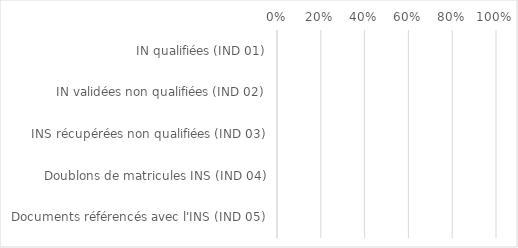
| Category | Series 0 |
|---|---|
| IN qualifiées (IND 01) | 0 |
| IN validées non qualifiées (IND 02) | 0 |
| INS récupérées non qualifiées (IND 03) | 0 |
| Doublons de matricules INS (IND 04) | 0 |
| Documents référencés avec l'INS (IND 05) | 0 |